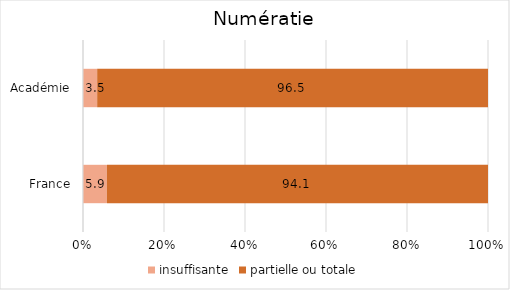
| Category | insuffisante | partielle ou totale |
|---|---|---|
| France | 5.9 | 94.1 |
| Académie | 3.5 | 96.5 |